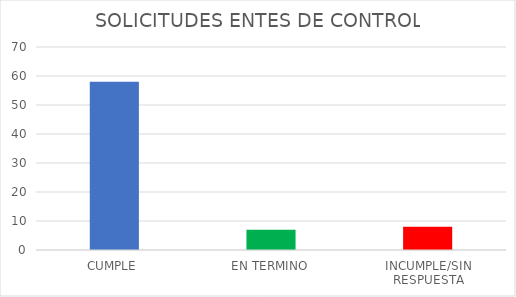
| Category | TOTAL |
|---|---|
| CUMPLE | 58 |
| EN TERMINO | 7 |
| INCUMPLE/SIN RESPUESTA | 8 |